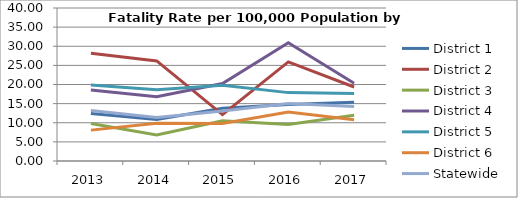
| Category | District 1 | District 2 | District 3 | District 4 | District 5 | District 6 | Statewide |
|---|---|---|---|---|---|---|---|
| 2013.0 | 12.411 | 28.146 | 9.828 | 18.532 | 19.863 | 8.074 | 13.212 |
| 2014.0 | 10.84 | 26.16 | 6.784 | 16.798 | 18.649 | 9.894 | 11.38 |
| 2015.0 | 13.777 | 12.106 | 10.539 | 20.271 | 19.828 | 9.808 | 13.052 |
| 2016.0 | 14.778 | 25.909 | 9.542 | 30.936 | 17.877 | 12.832 | 15.031 |
| 2017.0 | 15.329 | 19.351 | 11.976 | 20.334 | 17.663 | 10.802 | 14.269 |